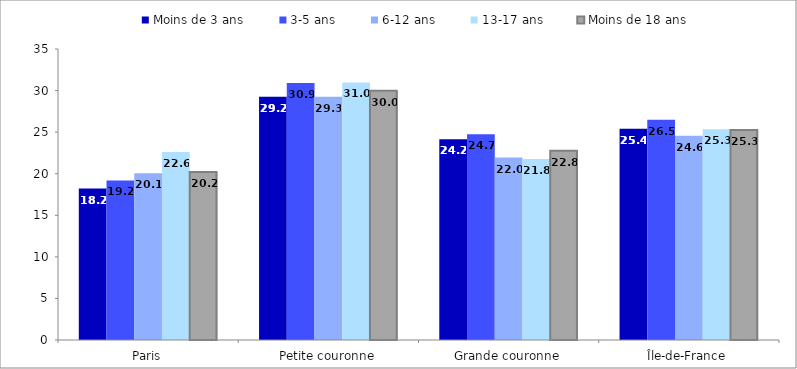
| Category | Moins de 3 ans | 3-5 ans | 6-12 ans | 13-17 ans | Moins de 18 ans |
|---|---|---|---|---|---|
| Paris | 18.215 | 19.185 | 20.065 | 22.607 | 20.217 |
| Petite couronne | 29.25 | 30.919 | 29.264 | 30.981 | 29.981 |
| Grande couronne | 24.155 | 24.747 | 21.95 | 21.768 | 22.759 |
| Île-de-France | 25.413 | 26.49 | 24.557 | 25.341 | 25.251 |